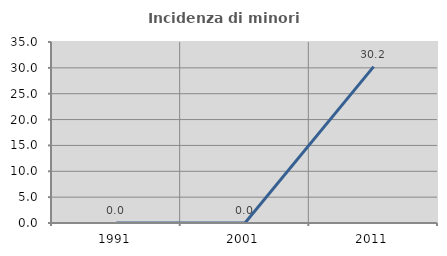
| Category | Incidenza di minori stranieri |
|---|---|
| 1991.0 | 0 |
| 2001.0 | 0 |
| 2011.0 | 30.233 |